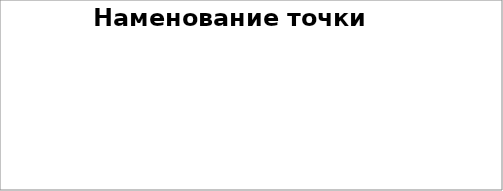
| Category | Наименование точки |
|---|---|
| 15-17 | 0 |
| 17-22 | 0 |
| 22-30 | 0 |
| 30-40 | 0 |
| 40-50 | 0 |
| 50 и более | 0 |